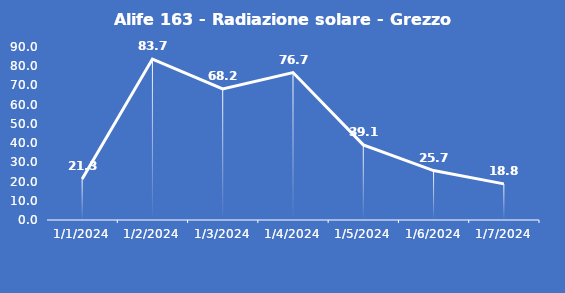
| Category | Alife 163 - Radiazione solare - Grezzo (W/m2) |
|---|---|
| 1/1/24 | 21.3 |
| 1/2/24 | 83.7 |
| 1/3/24 | 68.2 |
| 1/4/24 | 76.7 |
| 1/5/24 | 39.1 |
| 1/6/24 | 25.7 |
| 1/7/24 | 18.8 |